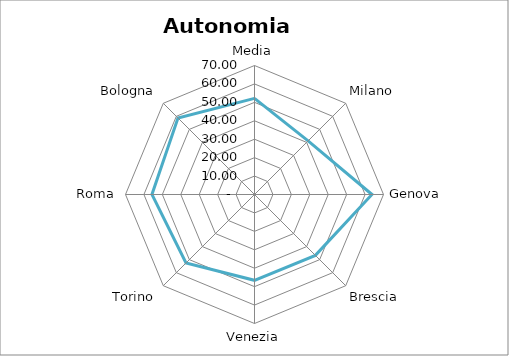
| Category | Autonomia impositiva |
|---|---|
| Media | 52.157 |
| Milano | 41.13 |
| Genova | 63.75 |
| Brescia | 46.71 |
| Venezia | 46.57 |
| Torino | 52.57 |
| Roma | 55.65 |
| Bologna | 58.72 |